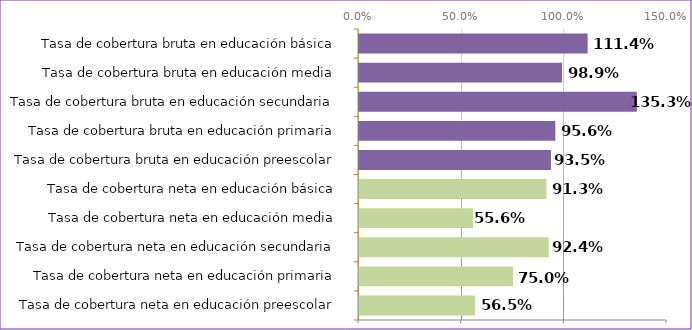
| Category | Series 0 |
|---|---|
| Tasa de cobertura neta en educación preescolar | 0.565 |
| Tasa de cobertura neta en educación primaria | 0.75 |
| Tasa de cobertura neta en educación secundaria | 0.924 |
| Tasa de cobertura neta en educación media | 0.556 |
| Tasa de cobertura neta en educación básica | 0.913 |
| Tasa de cobertura bruta en educación preescolar | 0.935 |
| Tasa de cobertura bruta en educación primaria | 0.956 |
| Tasa de cobertura bruta en educación secundaria | 1.353 |
| Tasa de cobertura bruta en educación media | 0.989 |
| Tasa de cobertura bruta en educación básica | 1.114 |